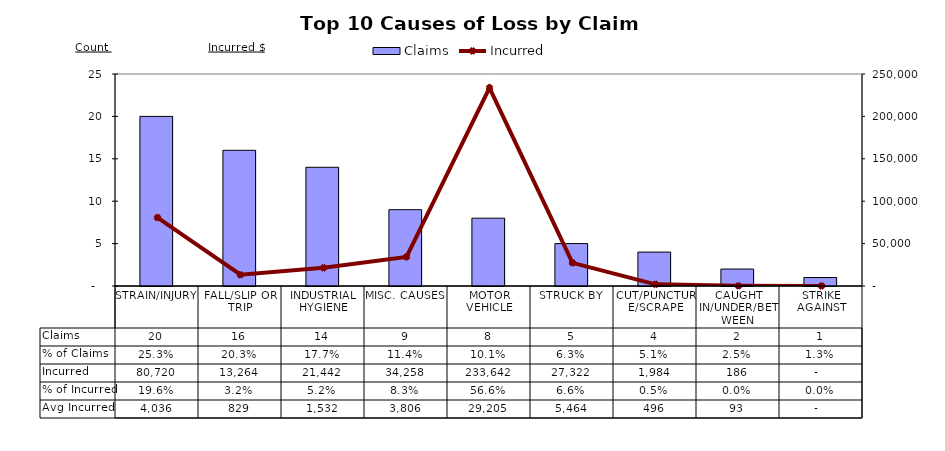
| Category | Claims |
|---|---|
| STRAIN/INJURY | 20 |
| FALL/SLIP OR TRIP | 16 |
| INDUSTRIAL HYGIENE | 14 |
| MISC. CAUSES | 9 |
| MOTOR VEHICLE | 8 |
| STRUCK BY | 5 |
| CUT/PUNCTURE/SCRAPE | 4 |
| CAUGHT IN/UNDER/BETWEEN | 2 |
| STRIKE AGAINST | 1 |